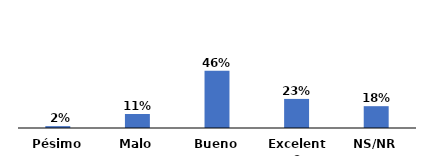
| Category | Series 0 |
|---|---|
| Pésimo | 0.015 |
| Malo | 0.113 |
| Bueno | 0.462 |
| Excelente | 0.235 |
| NS/NR | 0.176 |